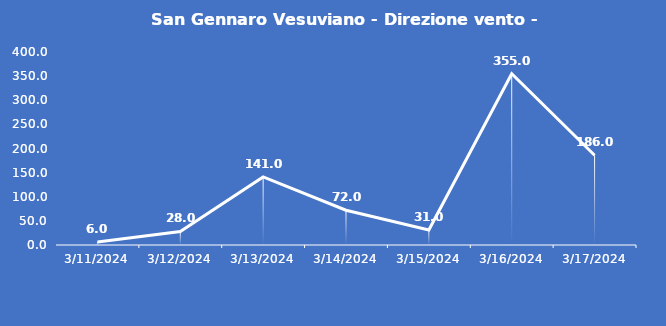
| Category | San Gennaro Vesuviano - Direzione vento - Grezzo (°N) |
|---|---|
| 3/11/24 | 6 |
| 3/12/24 | 28 |
| 3/13/24 | 141 |
| 3/14/24 | 72 |
| 3/15/24 | 31 |
| 3/16/24 | 355 |
| 3/17/24 | 186 |